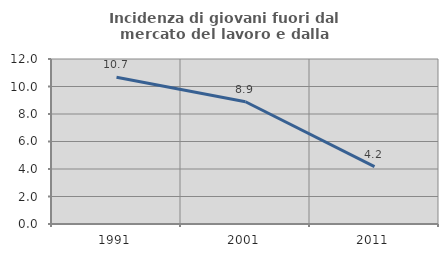
| Category | Incidenza di giovani fuori dal mercato del lavoro e dalla formazione  |
|---|---|
| 1991.0 | 10.68 |
| 2001.0 | 8.889 |
| 2011.0 | 4.167 |